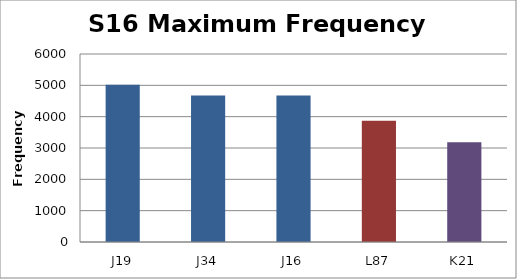
| Category | S16 Max Frequency (Hz) |
|---|---|
| J19 | 5019.61 |
| J34 | 4675.32 |
| J16 | 4675.32 |
| L87 | 3869.28 |
| K21 | 3181.82 |